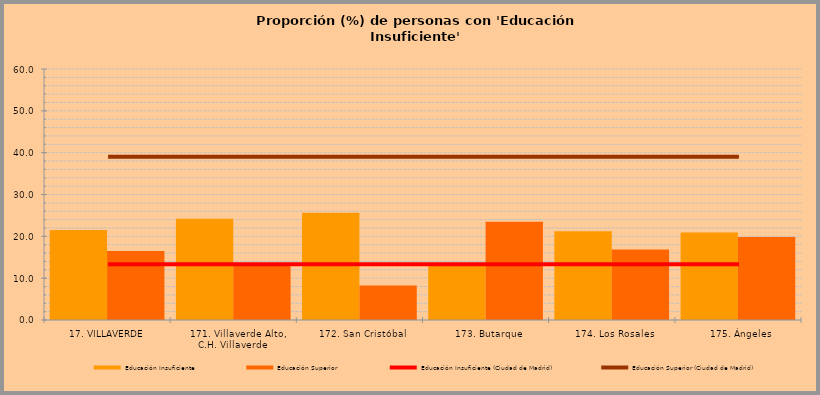
| Category | Educación Insuficiente | Educación Superior |
|---|---|---|
|  17. VILLAVERDE | 21.523 | 16.52 |
|    171. Villaverde Alto, C.H. Villaverde | 24.196 | 13.635 |
|    172. San Cristóbal | 25.654 | 8.266 |
|    173. Butarque | 13.349 | 23.505 |
|    174. Los Rosales | 21.217 | 16.828 |
|    175. Ángeles | 20.89 | 19.862 |